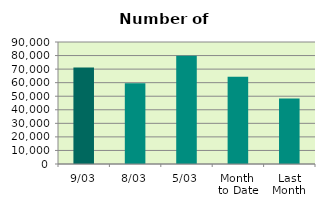
| Category | Series 0 |
|---|---|
| 9/03 | 71182 |
| 8/03 | 59526 |
| 5/03 | 79930 |
| Month 
to Date | 64306.857 |
| Last
Month | 48363.3 |